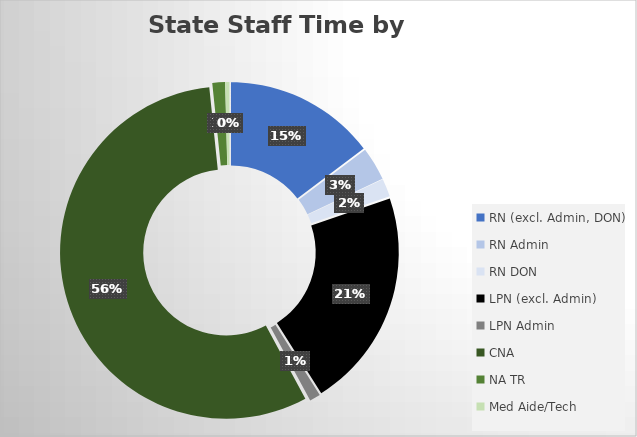
| Category | Series 0 |
|---|---|
| RN (excl. Admin, DON) | 1329.76 |
| RN Admin | 293.068 |
| RN DON | 159.326 |
| LPN (excl. Admin) | 1925.472 |
| LPN Admin | 95.655 |
| CNA | 5080.29 |
| NA TR | 111.424 |
| Med Aide/Tech | 36.334 |